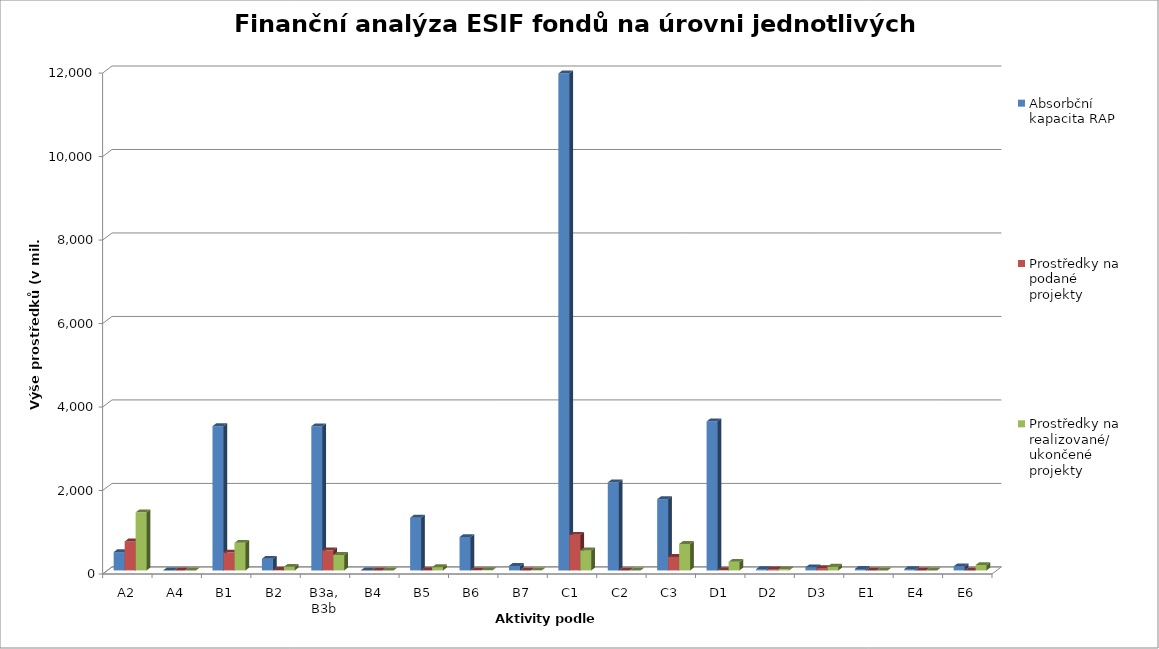
| Category | Absorbční kapacita RAP | Prostředky na podané projekty | Prostředky na realizované/ ukončené projekty |
|---|---|---|---|
| A2 | 440 | 694.187 | 1391.602 |
| A4 | 0 | 0 | 0 |
| B1 | 3456.414 | 428.207 | 660.37 |
| B2 | 279.604 | 11.636 | 86.477 |
| B3a, B3b | 3453.665 | 481 | 372.111 |
| B4 | 0 | 0 | 0 |
| B5 | 1262.721 | 7 | 78 |
| B6 | 800.184 | 2 | 9 |
| B7 | 108.177 | 0 | 4 |
| C1 | 11906.927 | 854 | 480 |
| C2 | 2108.96 | 0 | 0 |
| C3 | 1706.313 | 324 | 634 |
| D1 | 3571.174 | 9 | 205 |
| D2 | 29.101 | 25 | 26 |
| D3 | 72.651 | 55 | 89 |
| E1 | 35.4 | 0 | 1 |
| E4 | 30.1 | 0 | 0 |
| E6 | 98.884 | 0 | 130 |